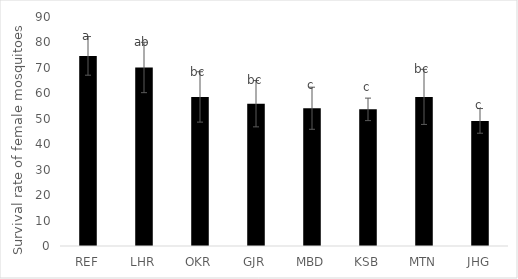
| Category | Series 0 |
|---|---|
| REF | 74.72 |
| LHR | 70.16 |
| OKR | 58.59 |
| GJR | 55.92 |
| MBD | 54.14 |
| KSB | 53.7 |
| MTN | 58.6 |
| JHG | 49.17 |